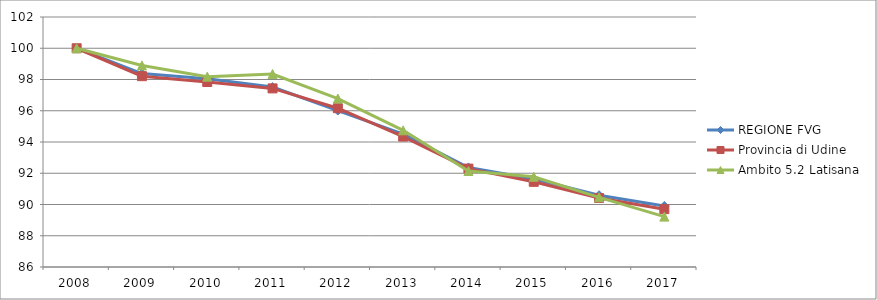
| Category | REGIONE FVG | Provincia di Udine | Ambito 5.2 Latisana |
|---|---|---|---|
| 2008.0 | 100 | 100 | 100 |
| 2009.0 | 98.378 | 98.213 | 98.899 |
| 2010.0 | 98.049 | 97.839 | 98.182 |
| 2011.0 | 97.515 | 97.431 | 98.349 |
| 2012.0 | 96.012 | 96.162 | 96.781 |
| 2013.0 | 94.5 | 94.348 | 94.746 |
| 2014.0 | 92.37 | 92.296 | 92.143 |
| 2015.0 | 91.632 | 91.451 | 91.776 |
| 2016.0 | 90.595 | 90.414 | 90.459 |
| 2017.0 | 89.908 | 89.702 | 89.224 |